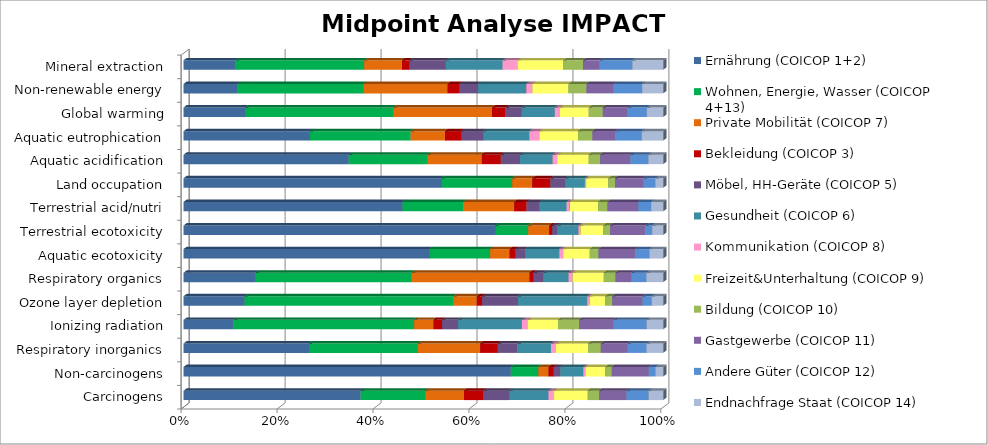
| Category | Ernährung (COICOP 1+2) | Wohnen, Energie, Wasser (COICOP 4+13) | Private Mobilität (COICOP 7) | Bekleidung (COICOP 3) | Möbel, HH-Geräte (COICOP 5) | Gesundheit (COICOP 6) | Kommunikation (COICOP 8) | Freizeit&Unterhaltung (COICOP 9) | Bildung (COICOP 10) | Gastgewerbe (COICOP 11) | Andere Güter (COICOP 12) | Endnachfrage Staat (COICOP 14) |
|---|---|---|---|---|---|---|---|---|---|---|---|---|
| Carcinogens | 572379353.026 | 208149856.566 | 125774320.866 | 61993706.553 | 84137900.162 | 126885925.311 | 17874908.039 | 108848025.717 | 36829789.091 | 88373120.281 | 71416048.313 | 47382850.995 |
| Non-carcinogens | 4975355245.359 | 418481976.499 | 153495765.536 | 82582985.1 | 99003390.973 | 350053390.814 | 27941651.457 | 303989442.911 | 100556172.616 | 561749001.22 | 104491356.793 | 115032795.057 |
| Respiratory inorganics | 19426999.565 | 16833633.048 | 9636723.871 | 2740686.28 | 3065468.578 | 5152424.198 | 784036.166 | 4970360.944 | 1959605.662 | 4131581.049 | 2965857.03 | 2560507.334 |
| Ionizing radiation | 329861563723.639 | 1180247696001.426 | 126296349626.051 | 56975848831.07 | 105330856595.628 | 417695524358.662 | 37834939581.073 | 197751838658.589 | 139063091409.924 | 226563833955.151 | 215136987660.296 | 108979436565.509 |
| Ozone layer depletion | 39166.193 | 133981.424 | 15013.46 | 3428.428 | 23020.61 | 44401.687 | 1414.836 | 10209.043 | 4478.315 | 19349.511 | 5972.503 | 7347.767 |
| Respiratory organics | 12404556.532 | 26933502.795 | 20237012.512 | 770495.963 | 1605612.073 | 4364578.234 | 690308.136 | 5388084.507 | 2019189.62 | 2737041.515 | 2611504.594 | 2861352.789 |
| Aquatic ecotoxicity | 9682163980453.795 | 2390747267618.91 | 767355389602.742 | 238780360478.604 | 385569125536.963 | 1339173974569.5 | 149826512014.393 | 1042603949378.446 | 348205234113.824 | 1462253727627.761 | 545088034364.076 | 541696947532.538 |
| Terrestrial ecotoxicity | 6009793047116.724 | 637366284232.487 | 406308353755.495 | 55936847748.825 | 104362672174.461 | 401431993853.034 | 38933205798.857 | 441219022780.492 | 129127106247.537 | 688804157157.386 | 126107341785.572 | 213774068682.233 |
| Terrestrial acid/nutri | 1099290528.245 | 306577248.967 | 253852742.263 | 62544468.033 | 66377319.285 | 134473157.601 | 15838576.892 | 141753410.76 | 46641660.021 | 154763475.264 | 64643078.181 | 61000637.486 |
| Land occupation | 8275714598.622 | 2271481535.811 | 646407209.6 | 584032925.227 | 482861371.329 | 624608721.475 | 37329524.87 | 712585845.75 | 214684946.418 | 922489841.388 | 381107146.923 | 244651172.658 |
| Aquatic acidification | 156383575.521 | 74622502.879 | 51245879.832 | 18135836.457 | 18103994.779 | 30895433.537 | 4313474.841 | 29869368.415 | 10872612.68 | 28590190.503 | 16931405.739 | 14149514.788 |
| Aquatic eutrophication | 7860528.873 | 6257338.285 | 2132924.332 | 1002830.382 | 1366845.495 | 2879583.008 | 614992.614 | 2399458.585 | 901215.09 | 1445499.242 | 1624589.003 | 1333203.344 |
| Global warming | 10666305753.682 | 25585088345.783 | 17090214887.857 | 2356659573.504 | 2814796125.139 | 5686328350.904 | 891244879.116 | 4967091202.568 | 2427869711.881 | 4349096390.696 | 3274738400.387 | 2835705944.509 |
| Non-renewable energy | 168765575005.501 | 393898164117.307 | 263484643000.26 | 37152623806.122 | 58540498123.926 | 150889328624.446 | 19155890360.383 | 113015775909.728 | 56278388271.049 | 85249248467.133 | 88752921227.616 | 66217642115.413 |
| Mineral extraction | 404775597.507 | 991244405.365 | 291384016.835 | 57321726.786 | 283219965.279 | 438032616.336 | 118103589.999 | 349783229.108 | 153195132.645 | 130277275.19 | 251392973.512 | 238063112.049 |